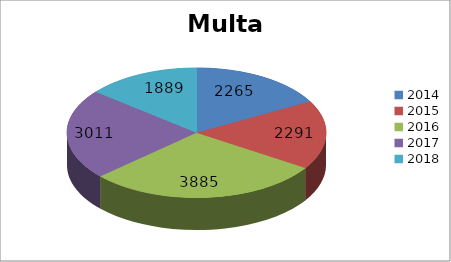
| Category | Multas |
|---|---|
| 2014.0 | 2265 |
| 2015.0 | 2291 |
| 2016.0 | 3885 |
| 2017.0 | 3011 |
| 2018.0 | 1889 |